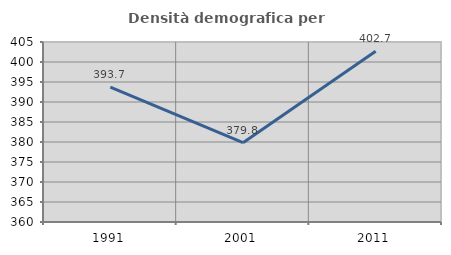
| Category | Densità demografica |
|---|---|
| 1991.0 | 393.73 |
| 2001.0 | 379.819 |
| 2011.0 | 402.707 |